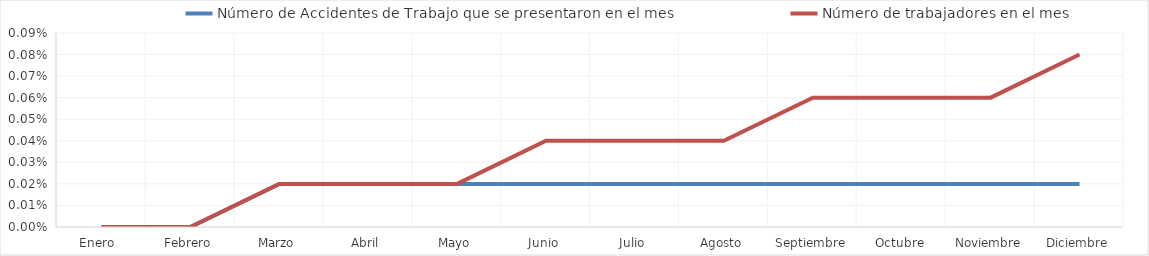
| Category | Número de Accidentes de Trabajo que se presentaron en el mes | Número de trabajadores en el mes |
|---|---|---|
| Enero  | 0 | 0 |
| Febrero | 0 | 0 |
| Marzo | 0 | 0 |
| Abril | 0 | 0 |
| Mayo | 0 | 0 |
| Junio | 0 | 0 |
| Julio | 0 | 0 |
| Agosto | 0 | 0 |
| Septiembre | 0 | 0.001 |
| Octubre | 0 | 0.001 |
| Noviembre | 0 | 0.001 |
| Diciembre | 0 | 0.001 |